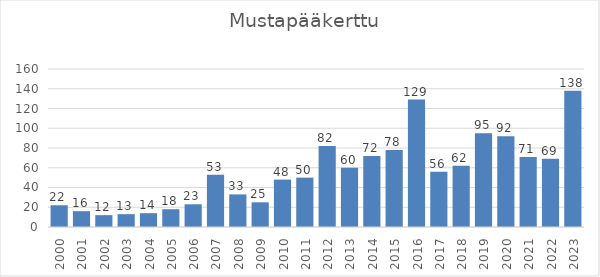
| Category | Series 0 |
|---|---|
| 2000.0 | 22 |
| 2001.0 | 16 |
| 2002.0 | 12 |
| 2003.0 | 13 |
| 2004.0 | 14 |
| 2005.0 | 18 |
| 2006.0 | 23 |
| 2007.0 | 53 |
| 2008.0 | 33 |
| 2009.0 | 25 |
| 2010.0 | 48 |
| 2011.0 | 50 |
| 2012.0 | 82 |
| 2013.0 | 60 |
| 2014.0 | 72 |
| 2015.0 | 78 |
| 2016.0 | 129 |
| 2017.0 | 56 |
| 2018.0 | 62 |
| 2019.0 | 95 |
| 2020.0 | 92 |
| 2021.0 | 71 |
| 2022.0 | 69 |
| 2023.0 | 138 |